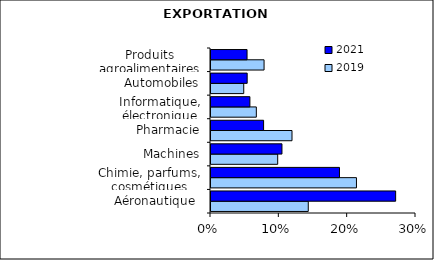
| Category | 2019 | 2021 |
|---|---|---|
| Aéronautique  | 0.142 | 0.27 |
| Chimie, parfums, cosmétiques | 0.213 | 0.188 |
| Machines | 0.098 | 0.104 |
| Pharmacie | 0.119 | 0.077 |
| Informatique, électronique | 0.066 | 0.057 |
| Automobiles | 0.048 | 0.053 |
| Produits agroalimentaires | 0.078 | 0.053 |